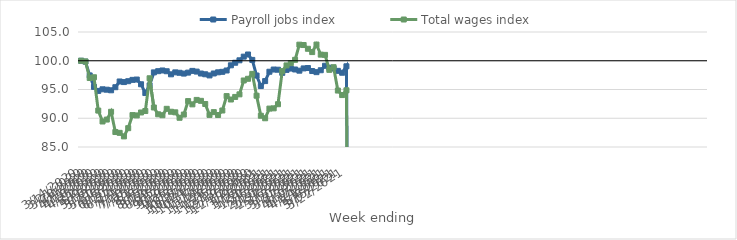
| Category | Payroll jobs index | Total wages index |
|---|---|---|
| 14/03/2020 | 100 | 100 |
| 21/03/2020 | 99.85 | 99.878 |
| 28/03/2020 | 97.446 | 96.997 |
| 04/04/2020 | 95.458 | 97.129 |
| 11/04/2020 | 94.758 | 91.332 |
| 18/04/2020 | 95.034 | 89.436 |
| 25/04/2020 | 94.965 | 89.77 |
| 02/05/2020 | 94.863 | 91.122 |
| 09/05/2020 | 95.399 | 87.603 |
| 16/05/2020 | 96.396 | 87.462 |
| 23/05/2020 | 96.292 | 86.844 |
| 30/05/2020 | 96.44 | 88.274 |
| 06/06/2020 | 96.676 | 90.55 |
| 13/06/2020 | 96.733 | 90.492 |
| 20/06/2020 | 95.911 | 91.003 |
| 27/06/2020 | 94.385 | 91.258 |
| 04/07/2020 | 95.709 | 96.954 |
| 11/07/2020 | 97.976 | 91.874 |
| 18/07/2020 | 98.187 | 90.69 |
| 25/07/2020 | 98.307 | 90.525 |
| 01/08/2020 | 98.174 | 91.64 |
| 08/08/2020 | 97.639 | 91.133 |
| 15/08/2020 | 97.978 | 91.032 |
| 22/08/2020 | 97.906 | 90.084 |
| 29/08/2020 | 97.767 | 90.643 |
| 05/09/2020 | 97.937 | 92.985 |
| 12/09/2020 | 98.236 | 92.416 |
| 19/09/2020 | 98.114 | 93.188 |
| 26/09/2020 | 97.778 | 93.03 |
| 03/10/2020 | 97.649 | 92.48 |
| 10/10/2020 | 97.45 | 90.581 |
| 17/10/2020 | 97.785 | 91.063 |
| 24/10/2020 | 97.987 | 90.565 |
| 31/10/2020 | 98.073 | 91.347 |
| 07/11/2020 | 98.305 | 93.851 |
| 14/11/2020 | 99.207 | 93.259 |
| 21/11/2020 | 99.653 | 93.709 |
| 28/11/2020 | 100.078 | 94.156 |
| 05/12/2020 | 100.713 | 96.569 |
| 12/12/2020 | 101.088 | 96.862 |
| 19/12/2020 | 100.148 | 97.72 |
| 26/12/2020 | 97.425 | 93.919 |
| 02/01/2021 | 95.599 | 90.432 |
| 09/01/2021 | 96.462 | 89.999 |
| 16/01/2021 | 98.089 | 91.68 |
| 23/01/2021 | 98.47 | 91.725 |
| 30/01/2021 | 98.441 | 92.438 |
| 06/02/2021 | 97.897 | 98.203 |
| 13/02/2021 | 98.409 | 99.188 |
| 20/02/2021 | 98.641 | 99.589 |
| 27/02/2021 | 98.479 | 100.163 |
| 06/03/2021 | 98.273 | 102.798 |
| 13/03/2021 | 98.666 | 102.734 |
| 20/03/2021 | 98.735 | 102.082 |
| 27/03/2021 | 98.213 | 101.508 |
| 03/04/2021 | 98.019 | 102.816 |
| 10/04/2021 | 98.349 | 101.064 |
| 17/04/2021 | 99.125 | 101.024 |
| 24/04/2021 | 98.788 | 98.418 |
| 01/05/2021 | 98.65 | 98.883 |
| 08/05/2021 | 98.244 | 94.816 |
| 15/05/2021 | 97.916 | 94.034 |
| 22/05/2021 | 99.038 | 94.86 |